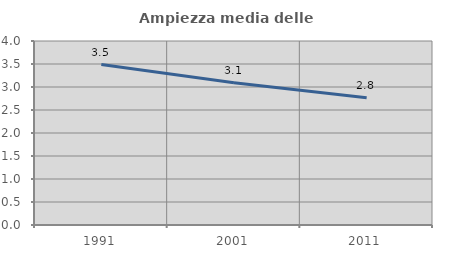
| Category | Ampiezza media delle famiglie |
|---|---|
| 1991.0 | 3.489 |
| 2001.0 | 3.094 |
| 2011.0 | 2.768 |